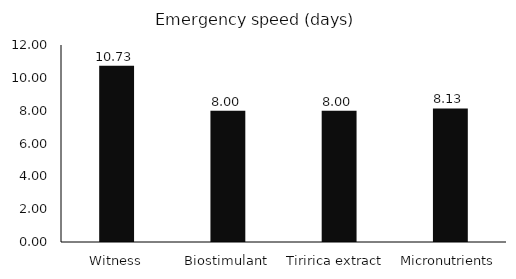
| Category | Series 0 |
|---|---|
| Witness | 10.733 |
| Biostimulant | 8 |
| Tiririca extract  | 8 |
| Micronutrients | 8.133 |